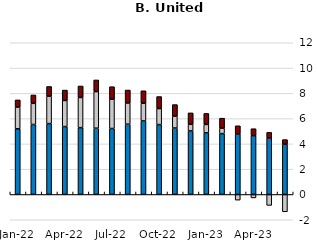
| Category | Core CPI | Energy | Food |
|---|---|---|---|
| 2022-01-01 | 5.196 | 1.718 | 0.566 |
| 2022-02-01 | 5.535 | 1.674 | 0.662 |
| 2022-03-01 | 5.606 | 2.172 | 0.764 |
| 2022-04-01 | 5.372 | 2.061 | 0.825 |
| 2022-05-01 | 5.286 | 2.386 | 0.91 |
| 2022-06-01 | 5.242 | 2.894 | 0.924 |
| 2022-07-01 | 5.217 | 2.314 | 0.994 |
| 2022-08-01 | 5.558 | 1.681 | 1.024 |
| 2022-09-01 | 5.816 | 1.401 | 0.986 |
| 2022-10-01 | 5.529 | 1.267 | 0.95 |
| 2022-11-01 | 5.256 | 0.943 | 0.912 |
| 2022-12-01 | 5.029 | 0.518 | 0.907 |
| 2023-01-01 | 4.874 | 0.665 | 0.871 |
| 2023-02-01 | 4.813 | 0.438 | 0.784 |
| 2023-03-01 | 4.789 | -0.448 | 0.644 |
| 2023-04-01 | 4.655 | -0.272 | 0.547 |
| 2023-05-01 | 4.469 | -0.864 | 0.443 |
| 2023-06-01 | 3.982 | -1.371 | 0.358 |